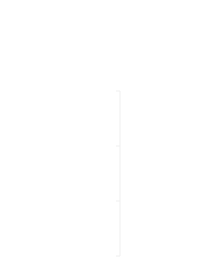
| Category | Pozitif | Negatif |
|---|---|---|
| 0 | 0 | 0 |
| 1 | 0 | 0 |
| 2 | 0 | 0 |